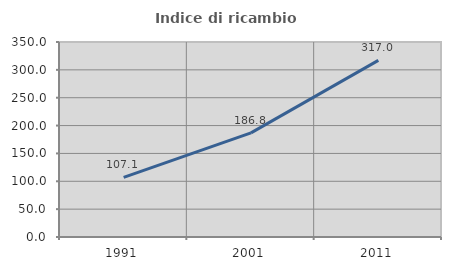
| Category | Indice di ricambio occupazionale  |
|---|---|
| 1991.0 | 107.087 |
| 2001.0 | 186.842 |
| 2011.0 | 316.981 |